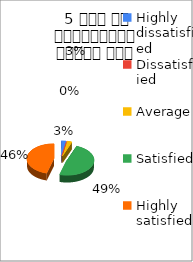
| Category | 5 समय पर पाठ्यक्रम  पूर्ण हुआ  |
|---|---|
| Highly dissatisfied | 1 |
| Dissatisfied | 0 |
| Average | 1 |
| Satisfied | 17 |
| Highly satisfied | 16 |